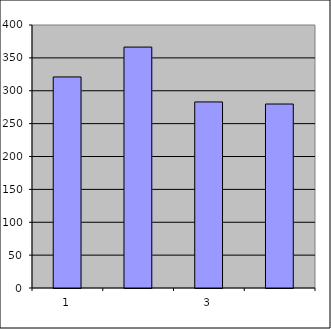
| Category | Series 0 |
|---|---|
| 0 | 321 |
| 1 | 366.419 |
| 2 | 282.971 |
| 3 | 279.807 |